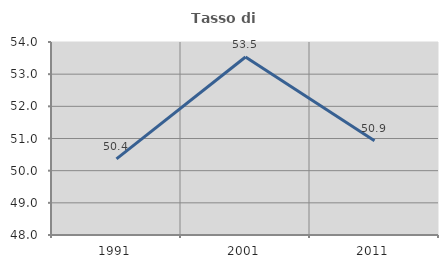
| Category | Tasso di occupazione   |
|---|---|
| 1991.0 | 50.366 |
| 2001.0 | 53.535 |
| 2011.0 | 50.93 |